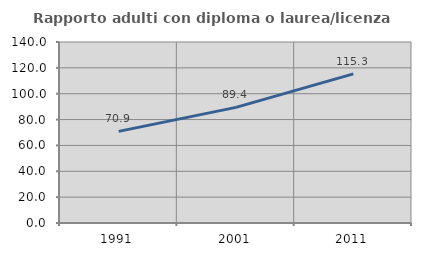
| Category | Rapporto adulti con diploma o laurea/licenza media  |
|---|---|
| 1991.0 | 70.868 |
| 2001.0 | 89.426 |
| 2011.0 | 115.335 |